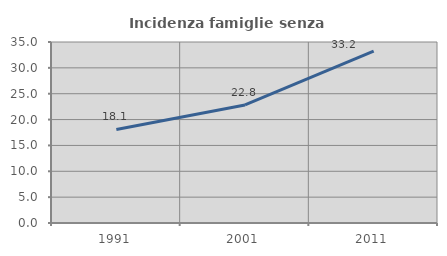
| Category | Incidenza famiglie senza nuclei |
|---|---|
| 1991.0 | 18.082 |
| 2001.0 | 22.832 |
| 2011.0 | 33.24 |